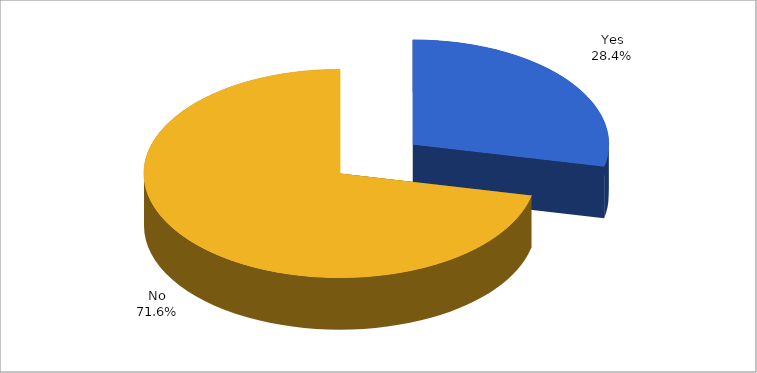
| Category | Series 0 |
|---|---|
| Yes | 0.284 |
| No | 0.716 |